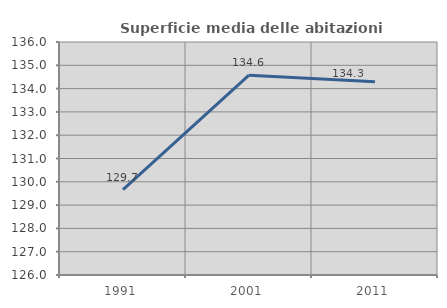
| Category | Superficie media delle abitazioni occupate |
|---|---|
| 1991.0 | 129.666 |
| 2001.0 | 134.576 |
| 2011.0 | 134.294 |